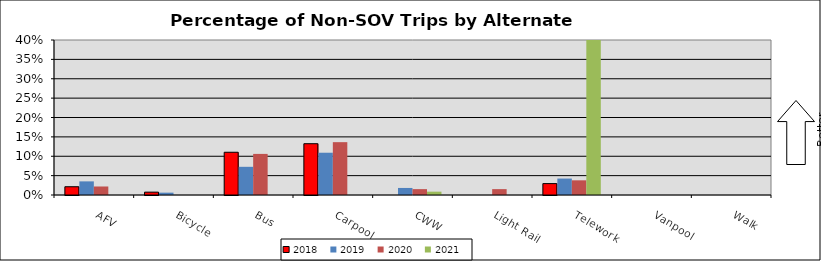
| Category | 2018 | 2019 | 2020 | 2021 |
|---|---|---|---|---|
| AFV | 0.021 | 0.035 | 0.022 | 0 |
| Bicycle | 0.007 | 0.006 | 0 | 0 |
| Bus | 0.11 | 0.073 | 0.106 | 0 |
| Carpool | 0.132 | 0.109 | 0.136 | 0 |
| CWW | 0 | 0.018 | 0.015 | 0.009 |
| Light Rail | 0 | 0 | 0.015 | 0 |
| Telework | 0.029 | 0.042 | 0.038 | 0.819 |
| Vanpool | 0 | 0 | 0 | 0 |
| Walk | 0 | 0 | 0 | 0 |